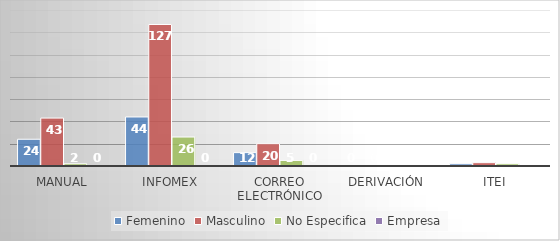
| Category | Femenino | Masculino | No Especifica | Empresa |
|---|---|---|---|---|
| Manual | 24 | 43 | 2 | 0 |
| Infomex | 44 | 127 | 26 | 0 |
| Correo Electrónico | 12 | 20 | 5 | 0 |
| Derivación | 0 | 0 | 0 | 0 |
| ITEI | 2 | 3 | 2 | 0 |